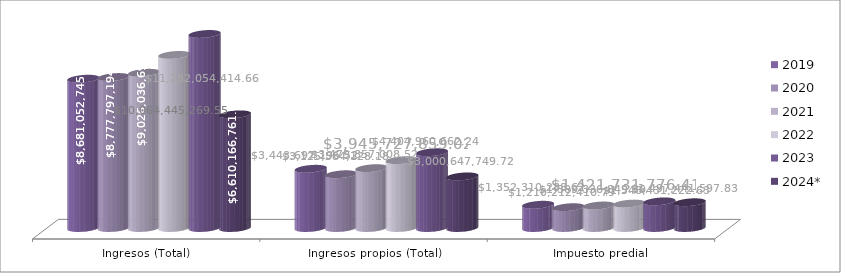
| Category | 2019 | 2020 | 2021 | 2022 | 2023 | 2024* |
|---|---|---|---|---|---|---|
| Ingresos (Total) | 8681052745.59 | 8777797194.58 | 9026036699.09 | 10064445269.55 | 11282054414.66 | 6610166761.48 |
| Ingresos propios (Total) | 3443697196.52 | 3125584128.18 | 3479857008.52 | 3945727859.02 | 4404960662.24 | 3000647749.72 |
| Impuesto predial | 1352310288.62 | 1210212410.79 | 1309336849.3 | 1421731776.41 | 1548431222.63 | 1497441597.83 |